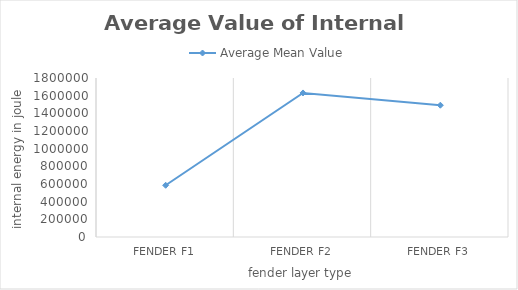
| Category | Average Mean Value |
|---|---|
| Fender F1 | 585628.4 |
| Fender F2 | 1630801.4 |
| Fender F3 | 1491874 |